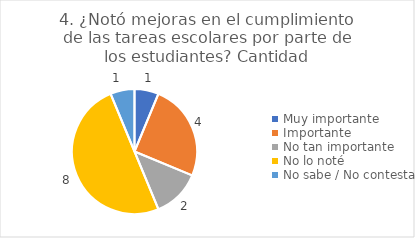
| Category | 4. ¿Notó mejoras en el cumplimiento de las tareas escolares por parte de los estudiantes? |
|---|---|
| Muy importante  | 0.062 |
| Importante  | 0.25 |
| No tan importante  | 0.125 |
| No lo noté  | 0.5 |
| No sabe / No contesta | 0.062 |